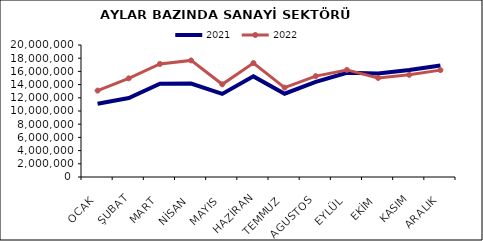
| Category | 2021 | 2022 |
|---|---|---|
| OCAK | 11085179.374 | 13088346.966 |
| ŞUBAT | 11957088.981 | 14951998.699 |
| MART | 14123660.142 | 17129835.749 |
| NİSAN | 14149258.634 | 17665789.177 |
| MAYIS | 12593860.709 | 14046779.522 |
| HAZİRAN | 15245752.905 | 17263964.484 |
| TEMMUZ | 12622823.791 | 13545028.035 |
| AGUSTOS | 14417188.674 | 15283129.008 |
| EYLÜL | 15801352.775 | 16224889.432 |
| EKİM | 15676458.933 | 15005709.463 |
| KASIM | 16218682.567 | 15481310.031 |
| ARALIK | 16908173.975 | 16193991.473 |